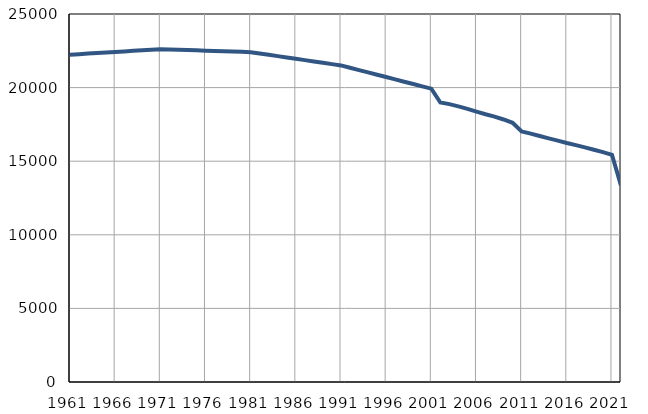
| Category | Population
size |
|---|---|
| 1961.0 | 22234 |
| 1962.0 | 22272 |
| 1963.0 | 22309 |
| 1964.0 | 22347 |
| 1965.0 | 22385 |
| 1966.0 | 22423 |
| 1967.0 | 22460 |
| 1968.0 | 22498 |
| 1969.0 | 22536 |
| 1970.0 | 22573 |
| 1971.0 | 22611 |
| 1972.0 | 22591 |
| 1973.0 | 22570 |
| 1974.0 | 22550 |
| 1975.0 | 22530 |
| 1976.0 | 22510 |
| 1977.0 | 22489 |
| 1978.0 | 22469 |
| 1979.0 | 22449 |
| 1980.0 | 22428 |
| 1981.0 | 22408 |
| 1982.0 | 22318 |
| 1983.0 | 22228 |
| 1984.0 | 22137 |
| 1985.0 | 22047 |
| 1986.0 | 21957 |
| 1987.0 | 21867 |
| 1988.0 | 21777 |
| 1989.0 | 21686 |
| 1990.0 | 21596 |
| 1991.0 | 21506 |
| 1992.0 | 21348 |
| 1993.0 | 21190 |
| 1994.0 | 21032 |
| 1995.0 | 20874 |
| 1996.0 | 20716 |
| 1997.0 | 20559 |
| 1998.0 | 20401 |
| 1999.0 | 20243 |
| 2000.0 | 20085 |
| 2001.0 | 19927 |
| 2002.0 | 18988 |
| 2003.0 | 18878 |
| 2004.0 | 18724 |
| 2005.0 | 18558 |
| 2006.0 | 18372 |
| 2007.0 | 18189 |
| 2008.0 | 18028 |
| 2009.0 | 17835 |
| 2010.0 | 17609 |
| 2011.0 | 17017 |
| 2012.0 | 16877 |
| 2013.0 | 16715 |
| 2014.0 | 16555 |
| 2015.0 | 16400 |
| 2016.0 | 16237 |
| 2017.0 | 16093 |
| 2018.0 | 15943 |
| 2019.0 | 15779 |
| 2020.0 | 15617 |
| 2021.0 | 15437 |
| 2022.0 | 13344 |